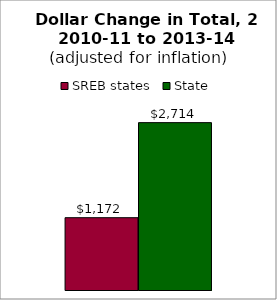
| Category | SREB states | State |
|---|---|---|
| 0 | 1172.461 | 2713.995 |